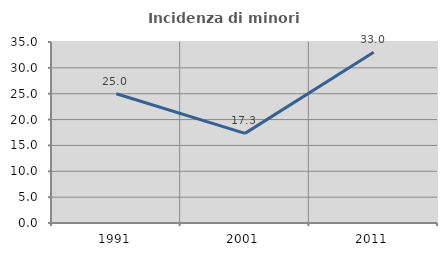
| Category | Incidenza di minori stranieri |
|---|---|
| 1991.0 | 25 |
| 2001.0 | 17.333 |
| 2011.0 | 33.023 |